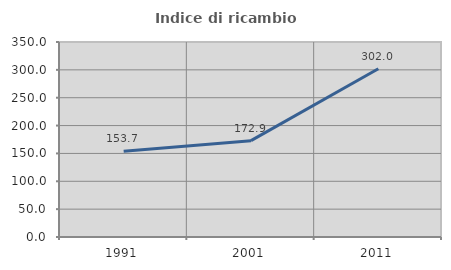
| Category | Indice di ricambio occupazionale  |
|---|---|
| 1991.0 | 153.742 |
| 2001.0 | 172.9 |
| 2011.0 | 302.015 |